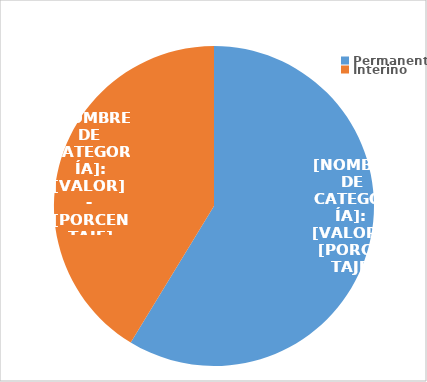
| Category | Series 0 |
|---|---|
| Permanente | 3248 |
| Interino | 2284 |